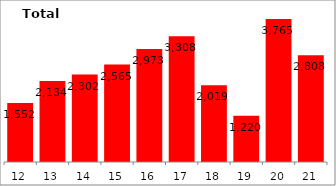
| Category | Total Debt |
|---|---|
| 2012-03-31 | 1551.7 |
| 2013-03-31 | 2134.39 |
| 2014-03-31 | 2302.31 |
| 2015-03-31 | 2565.42 |
| 2016-03-31 | 2972.77 |
| 2017-03-31 | 3307.96 |
| 2018-03-31 | 2019.49 |
| 2019-03-31 | 1220.16 |
| 2020-03-31 | 3764.73 |
| 2021-03-31 | 2808.36 |